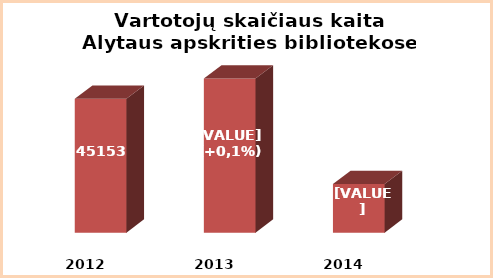
| Category | Series 0 |
|---|---|
| 2012.0 | 45153 |
| 2013.0 | 45199 |
| 2014.0 | 44960 |